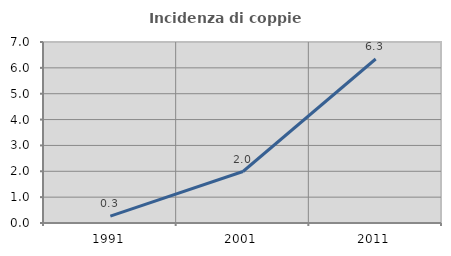
| Category | Incidenza di coppie miste |
|---|---|
| 1991.0 | 0.266 |
| 2001.0 | 1.992 |
| 2011.0 | 6.343 |